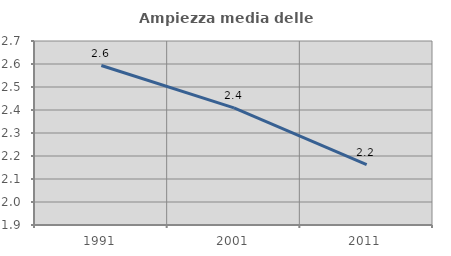
| Category | Ampiezza media delle famiglie |
|---|---|
| 1991.0 | 2.593 |
| 2001.0 | 2.409 |
| 2011.0 | 2.163 |